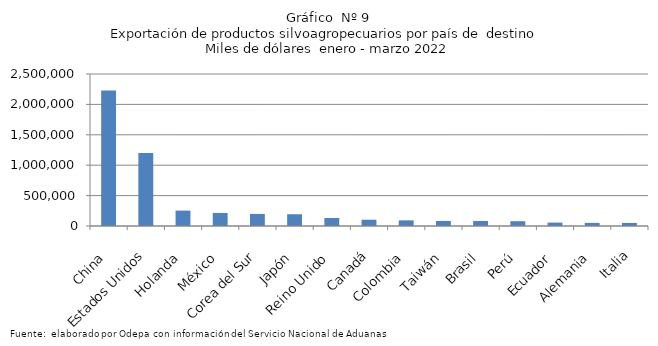
| Category | Series 0 |
|---|---|
| China | 2230582.553 |
| Estados Unidos | 1201859.068 |
| Holanda | 253404.912 |
| México | 214612.462 |
| Corea del Sur | 198142.738 |
| Japón | 193486.585 |
| Reino Unido | 131863.677 |
| Canadá | 103042.459 |
| Colombia | 92775 |
| Taiwán | 83080.157 |
| Brasil | 82064.856 |
| Perú | 78749.301 |
| Ecuador | 56121.316 |
| Alemania | 50976.893 |
| Italia | 50349.17 |